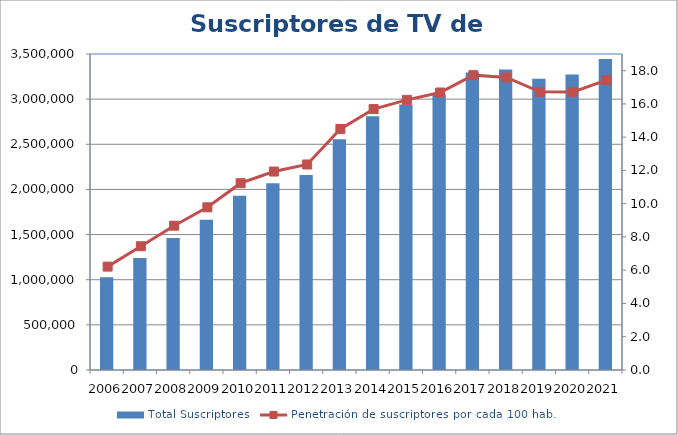
| Category | Total Suscriptores |
|---|---|
| 0 | 1026667 |
| 1 | 1241346 |
| 2 | 1461490 |
| 3 | 1664032 |
| 4 | 1928694 |
| 5 | 2067368 |
| 6 | 2159979 |
| 7 | 2555620 |
| 8 | 2809981 |
| 9 | 2940023 |
| 10 | 3050347 |
| 11 | 3294954 |
| 12 | 3329543 |
| 13 | 3224710 |
| 14 | 3272022 |
| 15 | 3443873 |